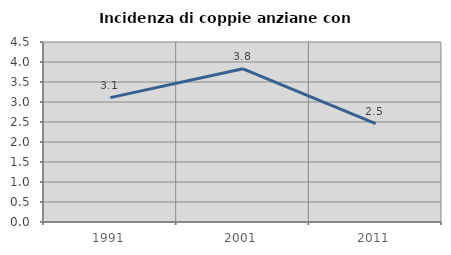
| Category | Incidenza di coppie anziane con figli |
|---|---|
| 1991.0 | 3.109 |
| 2001.0 | 3.83 |
| 2011.0 | 2.459 |